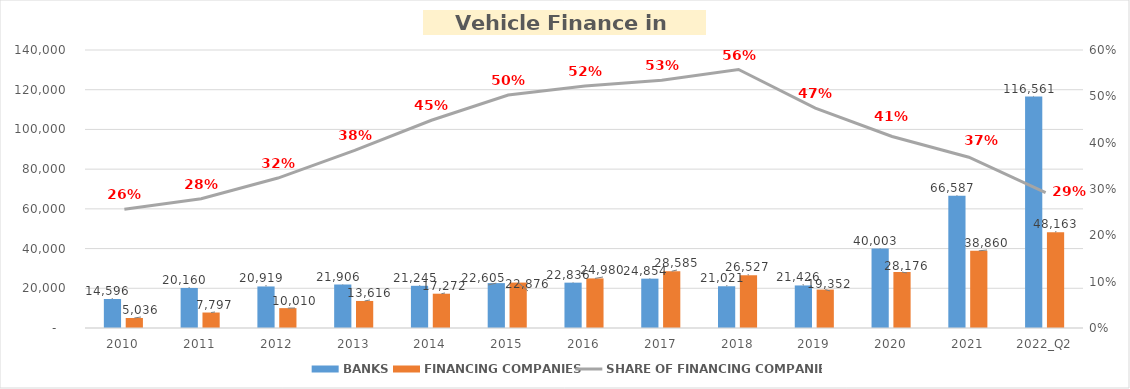
| Category | BANKS | FINANCING COMPANIES |
|---|---|---|
| 2010 | 14595.746 | 5035.89 |
| 2011 | 20160.143 | 7796.854 |
| 2012 | 20919.143 | 10009.755 |
| 2013 | 21905.99 | 13616.036 |
| 2014 | 21244.953 | 17271.844 |
| 2015 | 22605.033 | 22875.563 |
| 2016 | 22835.961 | 24980.231 |
| 2017 | 24853.571 | 28584.938 |
| 2018 | 21021.01 | 26527.133 |
| 2019 | 21426.278 | 19352.327 |
| 2020 | 40002.964 | 28176.3 |
| 2021 | 66586.576 | 38860.099 |
| 2022_Q2 | 116561.054 | 48163.078 |